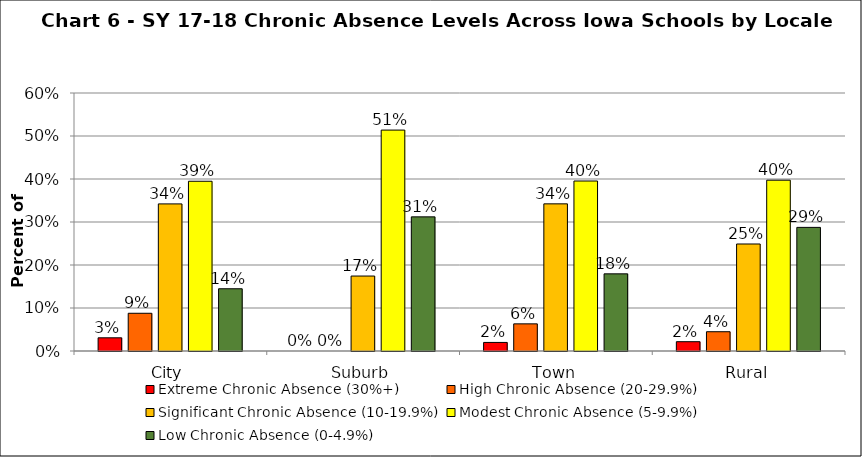
| Category | Extreme Chronic Absence (30%+) | High Chronic Absence (20-29.9%) | Significant Chronic Absence (10-19.9%) | Modest Chronic Absence (5-9.9%) | Low Chronic Absence (0-4.9%) |
|---|---|---|---|---|---|
| 0 | 0.031 | 0.088 | 0.342 | 0.395 | 0.145 |
| 1 | 0 | 0 | 0.174 | 0.514 | 0.312 |
| 2 | 0.02 | 0.063 | 0.342 | 0.395 | 0.179 |
| 3 | 0.022 | 0.045 | 0.249 | 0.397 | 0.287 |